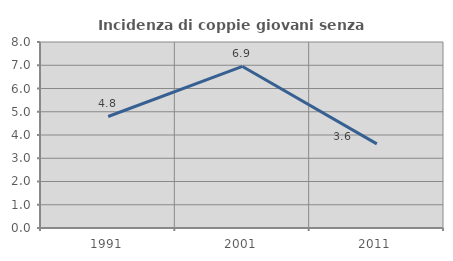
| Category | Incidenza di coppie giovani senza figli |
|---|---|
| 1991.0 | 4.796 |
| 2001.0 | 6.948 |
| 2011.0 | 3.618 |